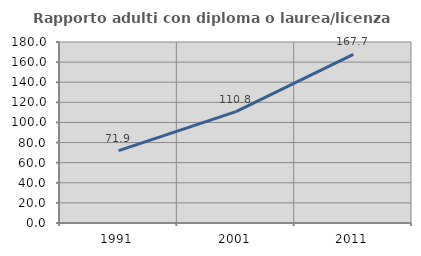
| Category | Rapporto adulti con diploma o laurea/licenza media  |
|---|---|
| 1991.0 | 71.907 |
| 2001.0 | 110.755 |
| 2011.0 | 167.712 |